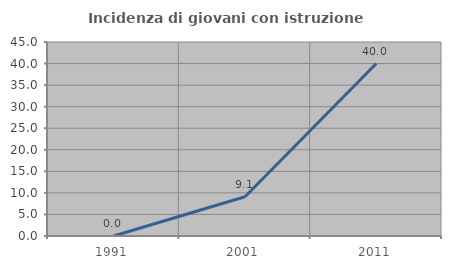
| Category | Incidenza di giovani con istruzione universitaria |
|---|---|
| 1991.0 | 0 |
| 2001.0 | 9.091 |
| 2011.0 | 40 |